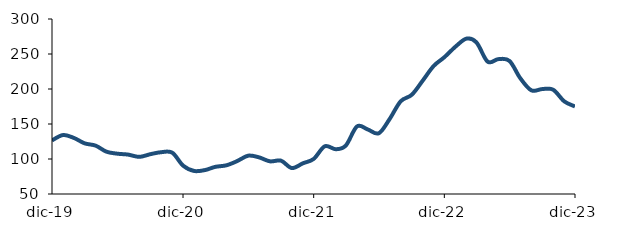
| Category | Series 0 |
|---|---|
| 2019-12-01 | 126.529 |
| 2020-01-01 | 134.255 |
| 2020-02-01 | 129.901 |
| 2020-03-01 | 122.394 |
| 2020-04-01 | 119.057 |
| 2020-05-01 | 110.456 |
| 2020-06-01 | 107.554 |
| 2020-07-01 | 106.253 |
| 2020-08-01 | 103.049 |
| 2020-09-01 | 106.902 |
| 2020-10-01 | 109.711 |
| 2020-11-01 | 109.011 |
| 2020-12-01 | 90.634 |
| 2021-01-01 | 82.908 |
| 2021-02-01 | 84.275 |
| 2021-03-01 | 88.757 |
| 2021-04-01 | 90.964 |
| 2021-05-01 | 96.958 |
| 2021-06-01 | 104.739 |
| 2021-07-01 | 102.396 |
| 2021-08-01 | 96.652 |
| 2021-09-01 | 97.59 |
| 2021-10-01 | 87.03 |
| 2021-11-01 | 93.888 |
| 2021-12-01 | 100.079 |
| 2022-01-01 | 118.131 |
| 2022-02-01 | 113.977 |
| 2022-03-01 | 119.323 |
| 2022-04-01 | 146.553 |
| 2022-05-01 | 142.197 |
| 2022-06-01 | 136.794 |
| 2022-07-01 | 156.982 |
| 2022-08-01 | 182.397 |
| 2022-09-01 | 191.729 |
| 2022-10-01 | 211.533 |
| 2022-11-01 | 232.804 |
| 2022-12-01 | 245.403 |
| 2023-01-01 | 260.441 |
| 2023-02-01 | 272.004 |
| 2023-03-01 | 266.361 |
| 2023-04-01 | 239.025 |
| 2023-05-01 | 242.673 |
| 2023-06-01 | 240.105 |
| 2023-07-01 | 215.499 |
| 2023-08-01 | 198.123 |
| 2023-09-01 | 199.949 |
| 2023-10-01 | 198.971 |
| 2023-11-01 | 182.347 |
| 2023-12-01 | 175.051 |